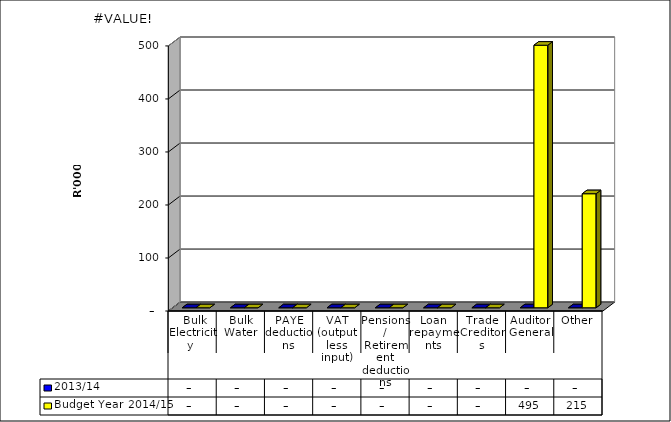
| Category | 2013/14 | Budget Year 2014/15 |
|---|---|---|
|  Bulk Electricity  | 0 | 0 |
| Bulk Water | 0 | 0 |
| PAYE deductions | 0 | 0 |
| VAT (output less input) | 0 | 0 |
| Pensions / Retirement deductions | 0 | 0 |
| Loan repayments | 0 | 0 |
| Trade Creditors | 0 | 0 |
| Auditor General | 0 | 495274 |
| Other | 0 | 215157 |